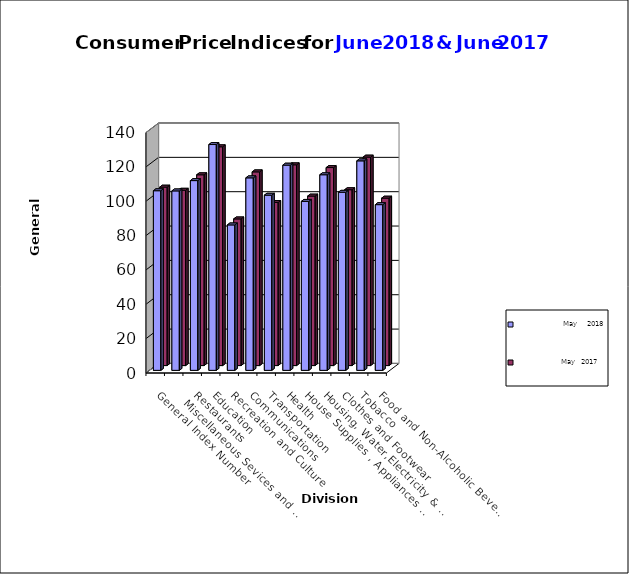
| Category |                        May     2018 |                       May   2017 |
|---|---|---|
| Food and Non-Alcoholic Beverages | 96.5 | 97.5 |
| Tobacco | 122 | 121.4 |
| Clothes and Footwear | 103.7 | 102.4 |
| Housing, Water,Electricity & LPG  | 113.9 | 115.3 |
| House Supplies , Appliances & Maintenance | 98.4 | 98.7 |
| Health | 119.5 | 116.9 |
| Transportation | 102 | 95 |
| Communications | 112.1 | 112.8 |
| Recreation and Culture | 84.7 | 85.4 |
| Education | 131.5 | 127.4 |
| Restaurants | 110.5 | 111.1 |
|    Miscellaneous Sevices and Goods | 104.5 | 102.1 |
| General Index Number | 104.6 | 103.9 |